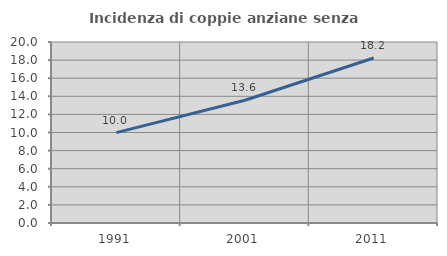
| Category | Incidenza di coppie anziane senza figli  |
|---|---|
| 1991.0 | 9.986 |
| 2001.0 | 13.563 |
| 2011.0 | 18.231 |